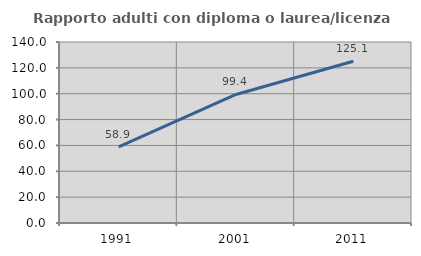
| Category | Rapporto adulti con diploma o laurea/licenza media  |
|---|---|
| 1991.0 | 58.865 |
| 2001.0 | 99.433 |
| 2011.0 | 125.065 |